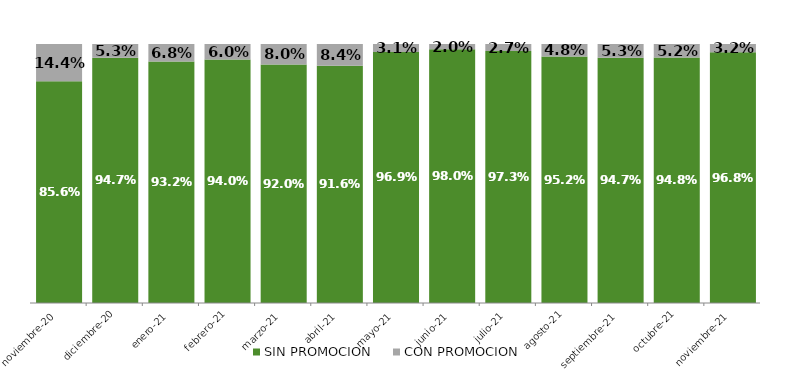
| Category | SIN PROMOCION   | CON PROMOCION   |
|---|---|---|
| 2020-11-01 | 0.856 | 0.144 |
| 2020-12-01 | 0.947 | 0.053 |
| 2021-01-01 | 0.932 | 0.068 |
| 2021-02-01 | 0.94 | 0.06 |
| 2021-03-01 | 0.92 | 0.08 |
| 2021-04-01 | 0.916 | 0.084 |
| 2021-05-01 | 0.969 | 0.031 |
| 2021-06-01 | 0.98 | 0.02 |
| 2021-07-01 | 0.973 | 0.027 |
| 2021-08-01 | 0.952 | 0.048 |
| 2021-09-01 | 0.947 | 0.053 |
| 2021-10-01 | 0.948 | 0.052 |
| 2021-11-01 | 0.968 | 0.032 |